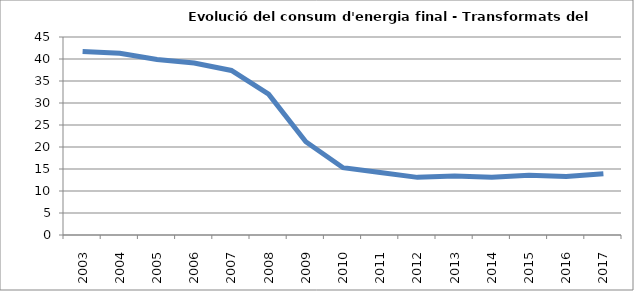
| Category | 41,7 41,3 39,9 39,1 37,4 32,0 21,2 15,3 14,2 13,1 13,4 13,1 13,6 13,3 13,9 |
|---|---|
| 2003.0 | 41.7 |
| 2004.0 | 41.3 |
| 2005.0 | 39.9 |
| 2006.0 | 39.1 |
| 2007.0 | 37.4 |
| 2008.0 | 32 |
| 2009.0 | 21.2 |
| 2010.0 | 15.3 |
| 2011.0 | 14.2 |
| 2012.0 | 13.1 |
| 2013.0 | 13.4 |
| 2014.0 | 13.1 |
| 2015.0 | 13.6 |
| 2016.0 | 13.3 |
| 2017.0 | 13.9 |